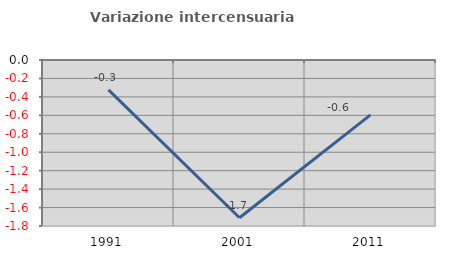
| Category | Variazione intercensuaria annua |
|---|---|
| 1991.0 | -0.325 |
| 2001.0 | -1.71 |
| 2011.0 | -0.595 |